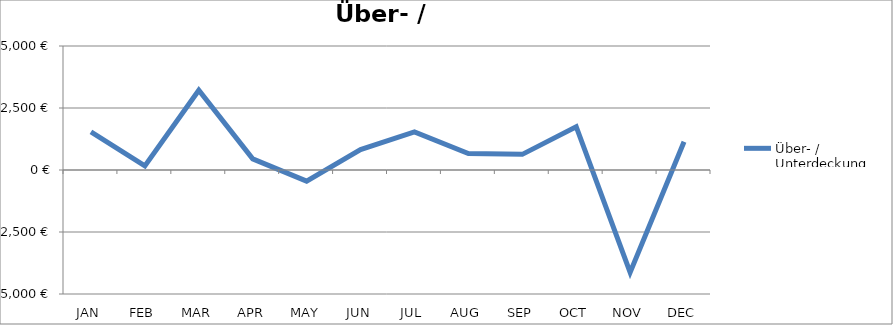
| Category | Über- / Unterdeckung |
|---|---|
| JAN | 1539 |
| FEB | 166 |
| MAR | 3216 |
| APR | 449 |
| MAY | -449 |
| JUN | 821 |
| JUL | 1534 |
| AUG | 661 |
| SEP | 631 |
| OCT | 1744 |
| NOV | -4129 |
| DEC | 1141 |